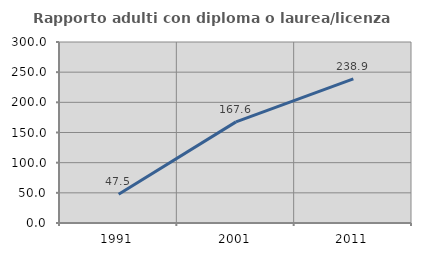
| Category | Rapporto adulti con diploma o laurea/licenza media  |
|---|---|
| 1991.0 | 47.517 |
| 2001.0 | 167.571 |
| 2011.0 | 238.889 |